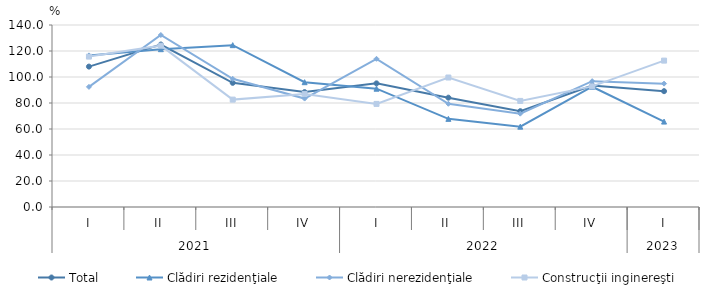
| Category | Total | Clădiri rezidenţiale | Clădiri nerezidenţiale | Construcţii inginereşti |
|---|---|---|---|---|
| 0 | 108 | 116.6 | 92.4 | 115.7 |
| 1 | 125 | 121.4 | 132.3 | 124.1 |
| 2 | 95.5 | 124.5 | 98.6 | 82.6 |
| 3 | 88.4 | 96 | 83.4 | 87 |
| 4 | 95.1 | 91 | 114 | 79.3 |
| 5 | 84.1 | 67.8 | 79.4 | 99.6 |
| 6 | 73.7 | 61.8 | 71.8 | 81.6 |
| 7 | 93.4 | 92.5 | 96.8 | 92.8 |
| 8 | 89.1 | 65.7 | 94.9 | 112.6 |